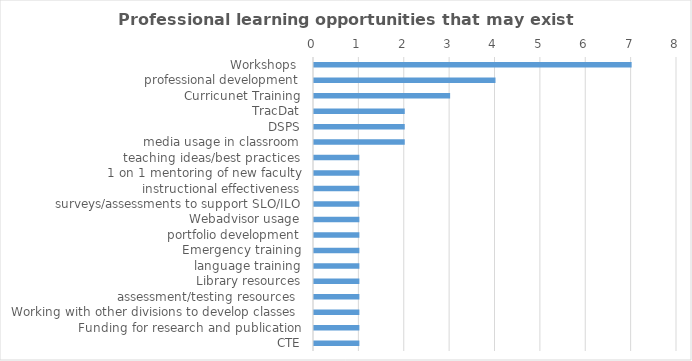
| Category | Series 0 |
|---|---|
| Workshops  | 7 |
| professional development | 4 |
| Curricunet Training | 3 |
| TracDat | 2 |
| DSPS | 2 |
| media usage in classroom | 2 |
| teaching ideas/best practices | 1 |
| 1 on 1 mentoring of new faculty | 1 |
| instructional effectiveness | 1 |
| surveys/assessments to support SLO/ILO | 1 |
| Webadvisor usage | 1 |
| portfolio development | 1 |
| Emergency training | 1 |
| language training | 1 |
| Library resources | 1 |
| assessment/testing resources  | 1 |
| Working with other divisions to develop classes  | 1 |
| Funding for research and publication | 1 |
| CTE | 1 |